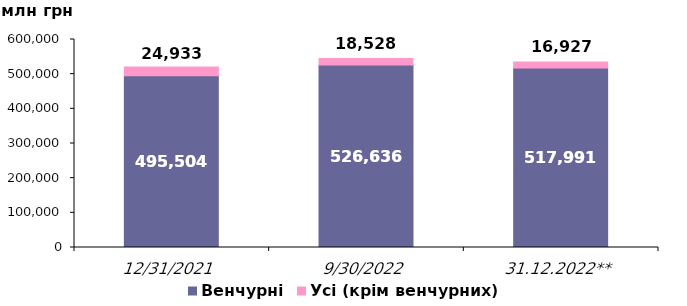
| Category | Венчурні | Усі (крім венчурних) |
|---|---|---|
| 31.12.2021 | 495503.925 | 24933.195 |
| 30.09.2022 | 526635.614 | 18527.657 |
| 31.12.2022** | 517991.01 | 16927.416 |